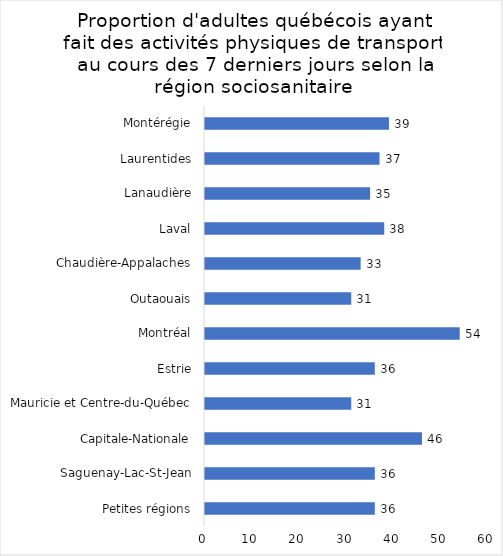
| Category | Series 0 |
|---|---|
| Petites régions | 36 |
| Saguenay-Lac-St-Jean | 36 |
| Capitale-Nationale | 46 |
| Mauricie et Centre-du-Québec | 31 |
| Estrie | 36 |
| Montréal | 54 |
| Outaouais | 31 |
| Chaudière-Appalaches | 33 |
| Laval | 38 |
| Lanaudière | 35 |
| Laurentides | 37 |
| Montérégie | 39 |